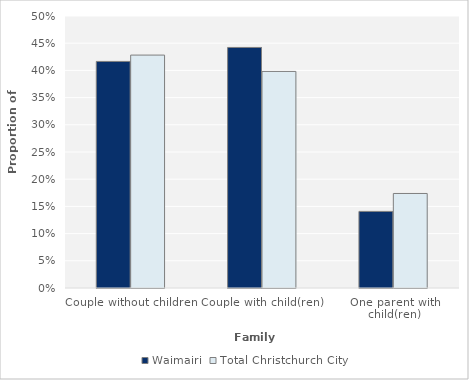
| Category | Waimairi | Total Christchurch City |
|---|---|---|
| Couple without children | 0.417 | 0.428 |
| Couple with child(ren) | 0.442 | 0.398 |
| One parent with child(ren) | 0.141 | 0.174 |